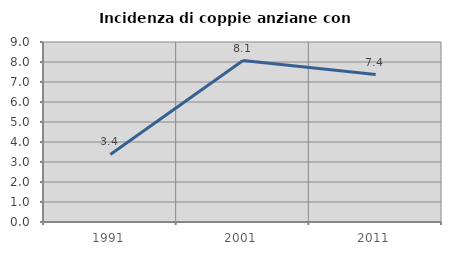
| Category | Incidenza di coppie anziane con figli |
|---|---|
| 1991.0 | 3.376 |
| 2001.0 | 8.072 |
| 2011.0 | 7.373 |